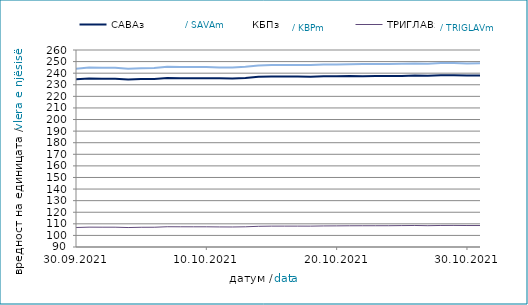
| Category | САВАз | КБПз | ТРИГЛАВз |
|---|---|---|---|
| 2021-09-30 | 234.694 | 243.89 | 106.827 |
| 2021-10-01 | 235.323 | 244.813 | 107.127 |
| 2021-10-02 | 235.23 | 244.681 | 107.084 |
| 2021-10-03 | 235.243 | 244.694 | 107.088 |
| 2021-10-04 | 234.547 | 243.846 | 106.798 |
| 2021-10-05 | 234.972 | 244.288 | 107.021 |
| 2021-10-06 | 235.036 | 244.496 | 107.049 |
| 2021-10-07 | 235.885 | 245.515 | 107.483 |
| 2021-10-08 | 235.714 | 245.315 | 107.434 |
| 2021-10-09 | 235.702 | 245.298 | 107.426 |
| 2021-10-10 | 235.714 | 245.311 | 107.43 |
| 2021-10-11 | 235.547 | 244.955 | 107.314 |
| 2021-10-12 | 235.509 | 244.945 | 107.277 |
| 2021-10-13 | 235.919 | 245.535 | 107.431 |
| 2021-10-14 | 236.815 | 246.586 | 107.862 |
| 2021-10-15 | 237.064 | 246.953 | 108.013 |
| 2021-10-16 | 237.068 | 246.966 | 108.016 |
| 2021-10-17 | 237.08 | 246.98 | 108.02 |
| 2021-10-18 | 236.987 | 247.01 | 108.008 |
| 2021-10-19 | 237.305 | 247.593 | 108.185 |
| 2021-10-20 | 237.34 | 247.567 | 108.241 |
| 2021-10-21 | 237.525 | 247.782 | 108.317 |
| 2021-10-22 | 237.43 | 247.822 | 108.345 |
| 2021-10-23 | 237.477 | 247.877 | 108.363 |
| 2021-10-24 | 237.489 | 247.89 | 108.367 |
| 2021-10-25 | 237.657 | 248.175 | 108.477 |
| 2021-10-26 | 238.003 | 248.417 | 108.58 |
| 2021-10-27 | 237.763 | 248.039 | 108.392 |
| 2021-10-28 | 238.147 | 248.707 | 108.59 |
| 2021-10-29 | 238.277 | 248.805 | 108.632 |
| 2021-10-30 | 238.019 | 248.454 | 108.527 |
| 2021-10-31 | 238.032 | 248.467 | 108.532 |